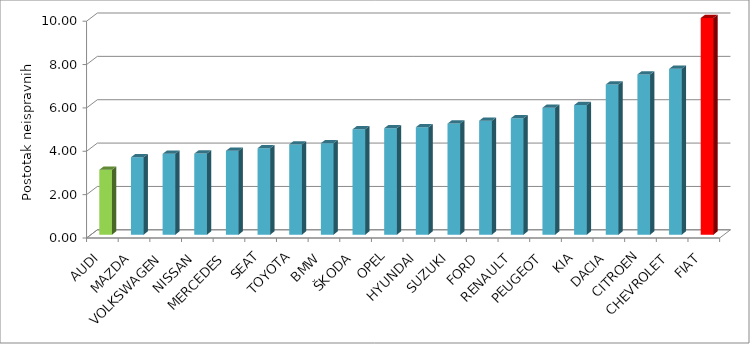
| Category | Series 4 |
|---|---|
| AUDI | 2.993 |
| MAZDA | 3.57 |
| VOLKSWAGEN | 3.728 |
| NISSAN | 3.738 |
| MERCEDES | 3.868 |
| SEAT | 3.987 |
| TOYOTA | 4.162 |
| BMW | 4.219 |
| ŠKODA | 4.859 |
| OPEL | 4.909 |
| HYUNDAI | 4.957 |
| SUZUKI | 5.123 |
| FORD | 5.255 |
| RENAULT | 5.369 |
| PEUGEOT | 5.854 |
| KIA | 5.976 |
| DACIA | 6.926 |
| CITROEN | 7.391 |
| CHEVROLET | 7.646 |
| FIAT | 9.992 |